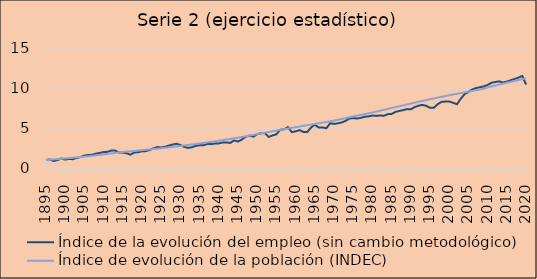
| Category | Índice de la evolución del empleo (sin cambio metodológico) | Índice de evolución de la población (INDEC) |
|---|---|---|
| 1895 | 1 | 1 |
| 1896 | 1.075 | 1.036 |
| 1897 | 0.873 | 1.073 |
| 1898 | 0.995 | 1.112 |
| 1899 | 1.178 | 1.152 |
| 1900 | 1.051 | 1.193 |
| 1901 | 1.132 | 1.236 |
| 1902 | 1.103 | 1.281 |
| 1903 | 1.253 | 1.327 |
| 1904 | 1.378 | 1.375 |
| 1905 | 1.552 | 1.424 |
| 1906 | 1.62 | 1.475 |
| 1907 | 1.645 | 1.529 |
| 1908 | 1.795 | 1.584 |
| 1909 | 1.873 | 1.641 |
| 1910 | 1.998 | 1.7 |
| 1911 | 2.022 | 1.761 |
| 1912 | 2.174 | 1.824 |
| 1913 | 2.185 | 1.89 |
| 1914 | 1.947 | 1.958 |
| 1915 | 1.925 | 2 |
| 1916 | 1.84 | 2.043 |
| 1917 | 1.664 | 2.087 |
| 1918 | 1.938 | 2.132 |
| 1919 | 1.978 | 2.178 |
| 1920 | 2.09 | 2.225 |
| 1921 | 2.112 | 2.273 |
| 1922 | 2.247 | 2.322 |
| 1923 | 2.458 | 2.372 |
| 1924 | 2.612 | 2.423 |
| 1925 | 2.565 | 2.476 |
| 1926 | 2.651 | 2.529 |
| 1927 | 2.8 | 2.583 |
| 1928 | 2.933 | 2.639 |
| 1929 | 3.027 | 2.696 |
| 1930 | 2.864 | 2.754 |
| 1931 | 2.631 | 2.813 |
| 1932 | 2.511 | 2.874 |
| 1933 | 2.595 | 2.936 |
| 1934 | 2.765 | 2.999 |
| 1935 | 2.85 | 3.064 |
| 1936 | 2.839 | 3.13 |
| 1937 | 3.008 | 3.198 |
| 1938 | 2.981 | 3.267 |
| 1939 | 3.059 | 3.337 |
| 1940 | 3.072 | 3.409 |
| 1941 | 3.195 | 3.482 |
| 1942 | 3.194 | 3.557 |
| 1943 | 3.136 | 3.634 |
| 1944 | 3.451 | 3.712 |
| 1945 | 3.303 | 3.793 |
| 1946 | 3.559 | 3.874 |
| 1947 | 3.913 | 3.958 |
| 1948 | 4.046 | 4.052 |
| 1949 | 3.918 | 4.146 |
| 1950 | 4.227 | 4.24 |
| 1951 | 4.35 | 4.331 |
| 1952 | 4.365 | 4.42 |
| 1953 | 3.884 | 4.507 |
| 1954 | 4.073 | 4.594 |
| 1955 | 4.213 | 4.679 |
| 1956 | 4.782 | 4.764 |
| 1957 | 4.835 | 4.848 |
| 1958 | 5.101 | 4.931 |
| 1959 | 4.485 | 5.014 |
| 1960 | 4.575 | 5.097 |
| 1961 | 4.738 | 5.179 |
| 1962 | 4.51 | 5.262 |
| 1963 | 4.485 | 5.344 |
| 1964 | 5.048 | 5.426 |
| 1965 | 5.416 | 5.509 |
| 1966 | 5.057 | 5.59 |
| 1967 | 5.069 | 5.67 |
| 1968 | 4.964 | 5.751 |
| 1969 | 5.594 | 5.835 |
| 1970 | 5.512 | 5.924 |
| 1971 | 5.585 | 6.021 |
| 1972 | 5.692 | 6.124 |
| 1973 | 5.883 | 6.23 |
| 1974 | 6.184 | 6.336 |
| 1975 | 6.244 | 6.44 |
| 1976 | 6.179 | 6.541 |
| 1977 | 6.276 | 6.641 |
| 1978 | 6.406 | 6.741 |
| 1979 | 6.452 | 6.842 |
| 1980 | 6.563 | 6.945 |
| 1981 | 6.513 | 7.052 |
| 1982 | 6.567 | 7.16 |
| 1983 | 6.527 | 7.27 |
| 1984 | 6.729 | 7.381 |
| 1985 | 6.754 | 7.492 |
| 1986 | 7.009 | 7.604 |
| 1987 | 7.132 | 7.717 |
| 1988 | 7.237 | 7.83 |
| 1989 | 7.361 | 7.943 |
| 1990 | 7.343 | 8.055 |
| 1991 | 7.619 | 8.165 |
| 1992 | 7.785 | 8.276 |
| 1993 | 7.887 | 8.385 |
| 1994 | 7.774 | 8.493 |
| 1995 | 7.523 | 8.598 |
| 1996 | 7.536 | 8.701 |
| 1997 | 7.98 | 8.802 |
| 1998 | 8.264 | 8.901 |
| 1999 | 8.302 | 8.999 |
| 2000 | 8.313 | 9.094 |
| 2001 | 8.153 | 9.186 |
| 2002 | 7.963 | 9.275 |
| 2003 | 8.653 | 9.362 |
| 2004 | 9.236 | 9.45 |
| 2005 | 9.501 | 9.541 |
| 2006 | 9.817 | 9.634 |
| 2007 | 9.999 | 9.73 |
| 2008 | 10.09 | 9.826 |
| 2009 | 10.202 | 9.922 |
| 2010 | 10.388 | 10.084 |
| 2011 | 10.657 | 10.201 |
| 2012 | 10.748 | 10.317 |
| 2013 | 10.831 | 10.434 |
| 2014 | 10.675 | 10.549 |
| 2015 | 10.804 | 10.663 |
| 2016 | 10.971 | 10.777 |
| 2017 | 11.125 | 10.889 |
| 2018 | 11.292 | 11 |
| 2019 | 11.506 | 11.11 |
| 2020 | 10.432 | 11.218 |